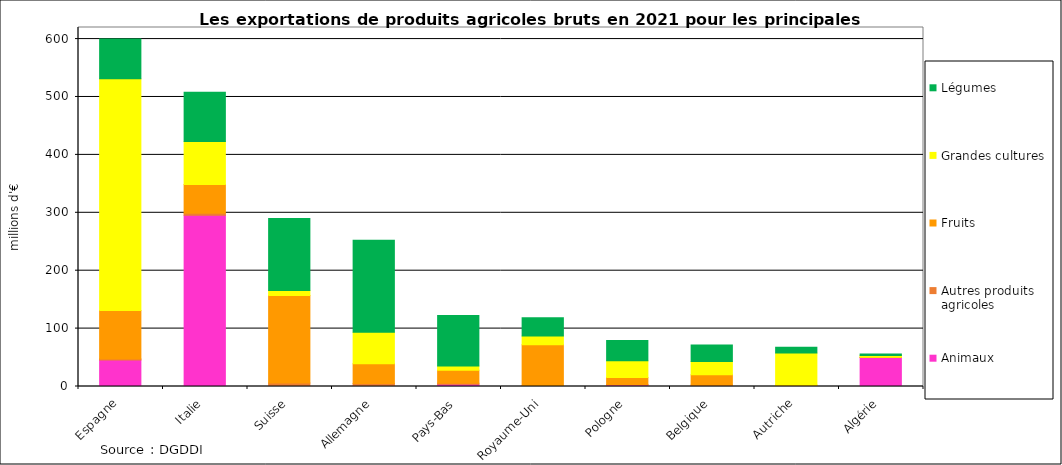
| Category | Animaux | Autres produits agricoles | Fruits | Grandes cultures | Légumes |
|---|---|---|---|---|---|
| Espagne | 45.961 | 1.514 | 83.991 | 400.18 | 68.284 |
| Italie | 295.59 | 3.536 | 49.849 | 73.973 | 85.067 |
| Suisse | 0.626 | 5.433 | 150.952 | 8.696 | 124.315 |
| Allemagne | 1.684 | 3.519 | 34.268 | 54.105 | 159.098 |
| Pays-Bas | 4.041 | 1.613 | 22.439 | 7.213 | 87.421 |
| Royaume-Uni | 1.098 | 0.506 | 70.334 | 15.441 | 31.158 |
| Pologne | 3.03 | 0.011 | 12.647 | 28.893 | 34.947 |
| Belgique | 0.718 | 1.986 | 17.621 | 22.659 | 28.759 |
| Autriche | 0.03 | 0.359 | 2.095 | 55.198 | 10.138 |
| Algérie | 50.248 | 0.146 | 0.189 | 3.003 | 2.445 |